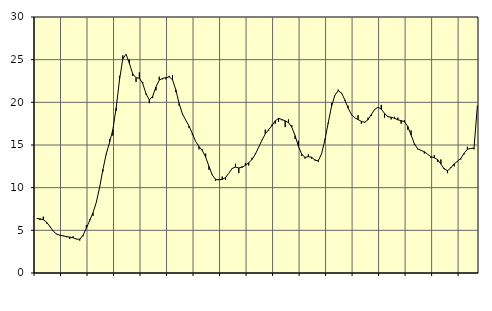
| Category | Piggar | Series 1 |
|---|---|---|
| nan | 6.4 | 6.39 |
| 87.0 | 6.2 | 6.35 |
| 87.0 | 6.6 | 6.24 |
| 87.0 | 5.8 | 5.96 |
| nan | 5.5 | 5.44 |
| 88.0 | 4.9 | 4.91 |
| 88.0 | 4.6 | 4.56 |
| 88.0 | 4.4 | 4.43 |
| nan | 4.4 | 4.35 |
| 89.0 | 4.2 | 4.26 |
| 89.0 | 4 | 4.21 |
| 89.0 | 4.3 | 4.13 |
| nan | 4 | 3.97 |
| 90.0 | 3.8 | 3.96 |
| 90.0 | 4.3 | 4.42 |
| 90.0 | 5.6 | 5.26 |
| nan | 6.3 | 6.15 |
| 91.0 | 6.7 | 7.06 |
| 91.0 | 8.3 | 8.29 |
| 91.0 | 10.1 | 10.04 |
| nan | 11.9 | 12.13 |
| 92.0 | 13.9 | 13.96 |
| 92.0 | 15.7 | 15.3 |
| 92.0 | 16.1 | 16.8 |
| nan | 19 | 19.35 |
| 93.0 | 23.1 | 22.62 |
| 93.0 | 25.5 | 25.1 |
| 93.0 | 25.6 | 25.63 |
| nan | 25 | 24.55 |
| 94.0 | 23.1 | 23.32 |
| 94.0 | 22.4 | 22.87 |
| 94.0 | 23.5 | 22.83 |
| nan | 22.4 | 22.22 |
| 95.0 | 20.9 | 21.02 |
| 95.0 | 19.9 | 20.28 |
| 95.0 | 20.5 | 20.71 |
| nan | 21.4 | 21.8 |
| 96.0 | 23 | 22.6 |
| 96.0 | 22.7 | 22.81 |
| 96.0 | 22.7 | 22.89 |
| nan | 23.1 | 22.99 |
| 97.0 | 23.2 | 22.65 |
| 97.0 | 21.2 | 21.46 |
| 97.0 | 19.6 | 19.87 |
| nan | 18.6 | 18.64 |
| 98.0 | 17.9 | 17.91 |
| 98.0 | 17 | 17.21 |
| 98.0 | 16.2 | 16.34 |
| nan | 15.4 | 15.4 |
| 99.0 | 14.5 | 14.82 |
| 99.0 | 14.5 | 14.35 |
| 99.0 | 14 | 13.59 |
| nan | 12.1 | 12.51 |
| 0.0 | 11.5 | 11.48 |
| 0.0 | 10.8 | 10.98 |
| 0.0 | 11 | 10.91 |
| nan | 11.3 | 10.97 |
| 1.0 | 10.9 | 11.18 |
| 1.0 | 11.7 | 11.69 |
| 1.0 | 12.2 | 12.25 |
| nan | 12.8 | 12.41 |
| 2.0 | 11.7 | 12.31 |
| 2.0 | 12.5 | 12.39 |
| 2.0 | 12.9 | 12.62 |
| nan | 12.6 | 12.92 |
| 3.0 | 13.5 | 13.3 |
| 3.0 | 14 | 13.92 |
| 3.0 | 14.7 | 14.74 |
| nan | 15.6 | 15.56 |
| 4.0 | 16.8 | 16.3 |
| 4.0 | 16.7 | 16.8 |
| 4.0 | 17.4 | 17.25 |
| nan | 17.5 | 17.83 |
| 5.0 | 17.7 | 18.12 |
| 5.0 | 17.9 | 17.99 |
| 5.0 | 17.1 | 17.83 |
| nan | 18 | 17.62 |
| 6.0 | 17.3 | 17.09 |
| 6.0 | 15.7 | 16.09 |
| 6.0 | 15.5 | 14.86 |
| nan | 13.7 | 13.92 |
| 7.0 | 13.4 | 13.55 |
| 7.0 | 13.9 | 13.63 |
| 7.0 | 13.4 | 13.57 |
| nan | 13.3 | 13.21 |
| 8.0 | 13 | 13.16 |
| 8.0 | 14 | 13.98 |
| 8.0 | 15.7 | 15.62 |
| nan | 17.5 | 17.61 |
| 9.0 | 19.9 | 19.53 |
| 9.0 | 20.8 | 20.83 |
| 9.0 | 21.5 | 21.36 |
| nan | 21 | 21.1 |
| 10.0 | 20.2 | 20.3 |
| 10.0 | 19.6 | 19.33 |
| 10.0 | 18.5 | 18.58 |
| nan | 18.2 | 18.19 |
| 11.0 | 18.5 | 17.98 |
| 11.0 | 17.5 | 17.77 |
| 11.0 | 17.6 | 17.66 |
| nan | 18.2 | 17.96 |
| 12.0 | 18.4 | 18.58 |
| 12.0 | 19.1 | 19.16 |
| 12.0 | 19.4 | 19.42 |
| nan | 19.7 | 19.21 |
| 13.0 | 18.2 | 18.69 |
| 13.0 | 18.4 | 18.32 |
| 13.0 | 18 | 18.25 |
| nan | 18.3 | 18.14 |
| 14.0 | 18.2 | 17.95 |
| 14.0 | 17.5 | 17.86 |
| 14.0 | 17.9 | 17.73 |
| nan | 16.8 | 17.18 |
| 15.0 | 16.7 | 16.17 |
| 15.0 | 15 | 15.15 |
| 15.0 | 14.5 | 14.55 |
| nan | 14.4 | 14.37 |
| 16.0 | 14 | 14.21 |
| 16.0 | 13.9 | 13.91 |
| 16.0 | 13.5 | 13.62 |
| nan | 13.8 | 13.5 |
| 17.0 | 13 | 13.29 |
| 17.0 | 13.3 | 12.76 |
| 17.0 | 12.3 | 12.19 |
| nan | 11.7 | 12 |
| 18.0 | 12.4 | 12.31 |
| 18.0 | 12.5 | 12.79 |
| 18.0 | 13 | 13.09 |
| nan | 13.3 | 13.43 |
| 19.0 | 13.9 | 14.02 |
| 19.0 | 14.8 | 14.51 |
| 19.0 | 14.6 | 14.59 |
| nan | 14.5 | 14.65 |
| 20.0 | 19.6 | 19.53 |